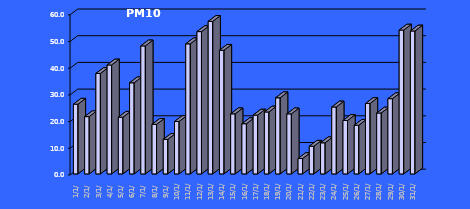
| Category | PM10 [µg/m3] |
|---|---|
| 2023-01-01 | 26.116 |
| 2023-01-02 | 21.449 |
| 2023-01-03 | 37.62 |
| 2023-01-04 | 40.804 |
| 2023-01-05 | 21.235 |
| 2023-01-06 | 34.128 |
| 2023-01-07 | 47.95 |
| 2023-01-08 | 18.556 |
| 2023-01-09 | 12.944 |
| 2023-01-10 | 19.621 |
| 2023-01-11 | 48.712 |
| 2023-01-12 | 53.302 |
| 2023-01-13 | 57.129 |
| 2023-01-14 | 46.317 |
| 2023-01-15 | 22.501 |
| 2023-01-16 | 18.795 |
| 2023-01-17 | 22.035 |
| 2023-01-18 | 23.196 |
| 2023-01-19 | 28.505 |
| 2023-01-20 | 22.487 |
| 2023-01-21 | 5.759 |
| 2023-01-22 | 10.375 |
| 2023-01-23 | 11.656 |
| 2023-01-24 | 25.068 |
| 2023-01-25 | 20.005 |
| 2023-01-26 | 18.23 |
| 2023-01-27 | 26.365 |
| 2023-01-28 | 22.81 |
| 2023-01-29 | 28.184 |
| 2023-01-30 | 53.882 |
| 2023-01-31 | 53.528 |